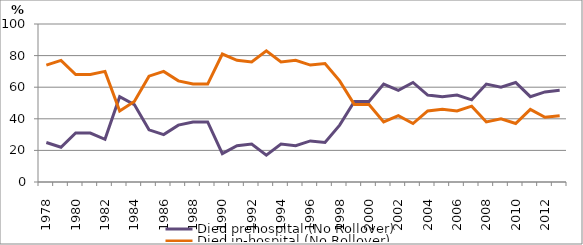
| Category | Died prehospital (No Rollover) | Died in-hospital (No Rollover) |
|---|---|---|
| 1978.0 | 25 | 74 |
| 1979.0 | 22 | 77 |
| 1980.0 | 31 | 68 |
| 1981.0 | 31 | 68 |
| 1982.0 | 27 | 70 |
| 1983.0 | 54 | 45 |
| 1984.0 | 49 | 51 |
| 1985.0 | 33 | 67 |
| 1986.0 | 30 | 70 |
| 1987.0 | 36 | 64 |
| 1988.0 | 38 | 62 |
| 1989.0 | 38 | 62 |
| 1990.0 | 18 | 81 |
| 1991.0 | 23 | 77 |
| 1992.0 | 24 | 76 |
| 1993.0 | 17 | 83 |
| 1994.0 | 24 | 76 |
| 1995.0 | 23 | 77 |
| 1996.0 | 26 | 74 |
| 1997.0 | 25 | 75 |
| 1998.0 | 36 | 64 |
| 1999.0 | 51 | 49 |
| 2000.0 | 51 | 49 |
| 2001.0 | 62 | 38 |
| 2002.0 | 58 | 42 |
| 2003.0 | 63 | 37 |
| 2004.0 | 55 | 45 |
| 2005.0 | 54 | 46 |
| 2006.0 | 55 | 45 |
| 2007.0 | 52 | 48 |
| 2008.0 | 62 | 38 |
| 2009.0 | 60 | 40 |
| 2010.0 | 63 | 37 |
| 2011.0 | 54 | 46 |
| 2012.0 | 57 | 41 |
| 2013.0 | 58 | 42 |